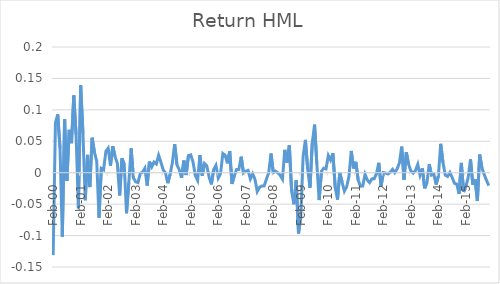
| Category | Series 0 |
|---|---|
| 2000-02-01 | -0.131 |
| 2000-03-01 | 0.08 |
| 2000-04-01 | 0.093 |
| 2000-05-01 | 0.039 |
| 2000-06-01 | -0.102 |
| 2000-07-01 | 0.086 |
| 2000-08-01 | -0.013 |
| 2000-09-01 | 0.068 |
| 2000-10-01 | 0.047 |
| 2000-11-01 | 0.123 |
| 2000-12-01 | 0.061 |
| 2001-01-01 | -0.057 |
| 2001-02-01 | 0.139 |
| 2001-03-01 | 0.062 |
| 2001-04-01 | -0.044 |
| 2001-05-01 | 0.028 |
| 2001-06-01 | -0.023 |
| 2001-07-01 | 0.056 |
| 2001-08-01 | 0.033 |
| 2001-09-01 | 0.018 |
| 2001-10-01 | -0.072 |
| 2001-11-01 | 0.007 |
| 2001-12-01 | 0.005 |
| 2002-01-01 | 0.034 |
| 2002-02-01 | 0.039 |
| 2002-03-01 | 0.011 |
| 2002-04-01 | 0.042 |
| 2002-05-01 | 0.026 |
| 2002-06-01 | 0.015 |
| 2002-07-01 | -0.036 |
| 2002-08-01 | 0.023 |
| 2002-09-01 | 0.013 |
| 2002-10-01 | -0.064 |
| 2002-11-01 | -0.016 |
| 2002-12-01 | 0.039 |
| 2003-01-01 | -0.008 |
| 2003-02-01 | -0.014 |
| 2003-03-01 | -0.016 |
| 2003-04-01 | -0.001 |
| 2003-05-01 | 0.001 |
| 2003-06-01 | 0.007 |
| 2003-07-01 | -0.02 |
| 2003-08-01 | 0.018 |
| 2003-09-01 | 0.009 |
| 2003-10-01 | 0.017 |
| 2003-11-01 | 0.014 |
| 2003-12-01 | 0.028 |
| 2004-01-01 | 0.017 |
| 2004-02-01 | 0.004 |
| 2004-03-01 | 0 |
| 2004-04-01 | -0.017 |
| 2004-05-01 | -0.003 |
| 2004-06-01 | 0.016 |
| 2004-07-01 | 0.046 |
| 2004-08-01 | 0.012 |
| 2004-09-01 | 0.005 |
| 2004-10-01 | -0.008 |
| 2004-11-01 | 0.019 |
| 2004-12-01 | -0.004 |
| 2005-01-01 | 0.027 |
| 2005-02-01 | 0.028 |
| 2005-03-01 | 0.017 |
| 2005-04-01 | -0.004 |
| 2005-05-01 | -0.012 |
| 2005-06-01 | 0.028 |
| 2005-07-01 | -0.005 |
| 2005-08-01 | 0.015 |
| 2005-09-01 | 0.011 |
| 2005-10-01 | -0.007 |
| 2005-11-01 | -0.018 |
| 2005-12-01 | 0.005 |
| 2006-01-01 | 0.012 |
| 2006-02-01 | -0.008 |
| 2006-03-01 | -0.001 |
| 2006-04-01 | 0.031 |
| 2006-05-01 | 0.028 |
| 2006-06-01 | 0.015 |
| 2006-07-01 | 0.034 |
| 2006-08-01 | -0.018 |
| 2006-09-01 | -0.005 |
| 2006-10-01 | 0.005 |
| 2006-11-01 | 0.005 |
| 2006-12-01 | 0.026 |
| 2007-01-01 | 0 |
| 2007-02-01 | 0.002 |
| 2007-03-01 | 0.004 |
| 2007-04-01 | -0.01 |
| 2007-05-01 | -0.002 |
| 2007-06-01 | -0.01 |
| 2007-07-01 | -0.03 |
| 2007-08-01 | -0.023 |
| 2007-09-01 | -0.021 |
| 2007-10-01 | -0.021 |
| 2007-11-01 | -0.01 |
| 2007-12-01 | 0 |
| 2008-01-01 | 0.03 |
| 2008-02-01 | 0 |
| 2008-03-01 | 0.002 |
| 2008-04-01 | 0 |
| 2008-05-01 | -0.004 |
| 2008-06-01 | -0.01 |
| 2008-07-01 | 0.036 |
| 2008-08-01 | 0.016 |
| 2008-09-01 | 0.044 |
| 2008-10-01 | -0.03 |
| 2008-11-01 | -0.05 |
| 2008-12-01 | -0.012 |
| 2009-01-01 | -0.097 |
| 2009-02-01 | -0.069 |
| 2009-03-01 | 0.025 |
| 2009-04-01 | 0.052 |
| 2009-05-01 | 0.006 |
| 2009-06-01 | -0.024 |
| 2009-07-01 | 0.047 |
| 2009-08-01 | 0.076 |
| 2009-09-01 | 0.014 |
| 2009-10-01 | -0.044 |
| 2009-11-01 | 0.002 |
| 2009-12-01 | 0.007 |
| 2010-01-01 | 0.006 |
| 2010-02-01 | 0.027 |
| 2010-03-01 | 0.02 |
| 2010-04-01 | 0.031 |
| 2010-05-01 | -0.023 |
| 2010-06-01 | -0.043 |
| 2010-07-01 | 0 |
| 2010-08-01 | -0.015 |
| 2010-09-01 | -0.029 |
| 2010-10-01 | -0.022 |
| 2010-11-01 | -0.006 |
| 2010-12-01 | 0.035 |
| 2011-01-01 | 0.007 |
| 2011-02-01 | 0.017 |
| 2011-03-01 | -0.012 |
| 2011-04-01 | -0.022 |
| 2011-05-01 | -0.021 |
| 2011-06-01 | -0.003 |
| 2011-07-01 | -0.012 |
| 2011-08-01 | -0.016 |
| 2011-09-01 | -0.01 |
| 2011-10-01 | -0.01 |
| 2011-11-01 | -0.002 |
| 2011-12-01 | 0.016 |
| 2012-01-01 | -0.021 |
| 2012-02-01 | 0 |
| 2012-03-01 | -0.001 |
| 2012-04-01 | -0.002 |
| 2012-05-01 | 0.001 |
| 2012-06-01 | 0.005 |
| 2012-07-01 | 0 |
| 2012-08-01 | 0.006 |
| 2012-09-01 | 0.016 |
| 2012-10-01 | 0.042 |
| 2012-11-01 | -0.011 |
| 2012-12-01 | 0.033 |
| 2013-01-01 | 0.013 |
| 2013-02-01 | 0.003 |
| 2013-03-01 | -0.001 |
| 2013-04-01 | 0.004 |
| 2013-05-01 | 0.013 |
| 2013-06-01 | -0.004 |
| 2013-07-01 | 0.007 |
| 2013-08-01 | -0.025 |
| 2013-09-01 | -0.016 |
| 2013-10-01 | 0.014 |
| 2013-11-01 | -0.004 |
| 2013-12-01 | -0.002 |
| 2014-01-01 | -0.019 |
| 2014-02-01 | -0.005 |
| 2014-03-01 | 0.046 |
| 2014-04-01 | 0.016 |
| 2014-05-01 | -0.004 |
| 2014-06-01 | -0.006 |
| 2014-07-01 | 0 |
| 2014-08-01 | -0.008 |
| 2014-09-01 | -0.017 |
| 2014-10-01 | -0.018 |
| 2014-11-01 | -0.034 |
| 2014-12-01 | 0.016 |
| 2015-01-01 | -0.031 |
| 2015-02-01 | -0.022 |
| 2015-03-01 | -0.007 |
| 2015-04-01 | 0.021 |
| 2015-05-01 | -0.019 |
| 2015-06-01 | -0.01 |
| 2015-07-01 | -0.045 |
| 2015-08-01 | 0.029 |
| 2015-09-01 | 0.007 |
| 2015-10-01 | -0.003 |
| 2015-11-01 | -0.012 |
| 2015-12-01 | -0.02 |